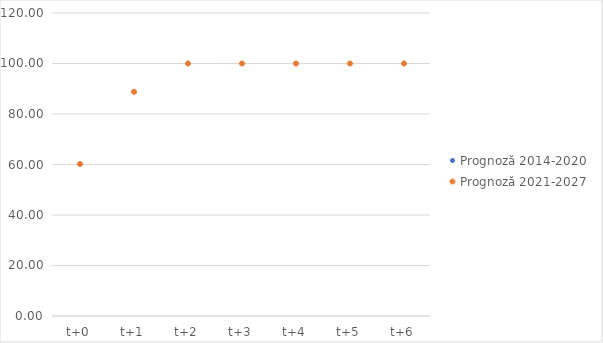
| Category | Prognoză 2014-2020 | Prognoză 2021-2027 |
|---|---|---|
| t+0 | 60.208 | 60.208 |
| t+1 | 88.779 | 88.779 |
| t+2 | 100 | 100 |
| t+3 | 100 | 100 |
| t+4 | 100 | 100 |
| t+5 | 100 | 100 |
| t+6 | 100 | 100 |